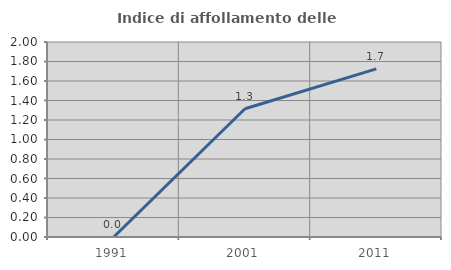
| Category | Indice di affollamento delle abitazioni  |
|---|---|
| 1991.0 | 0 |
| 2001.0 | 1.316 |
| 2011.0 | 1.724 |